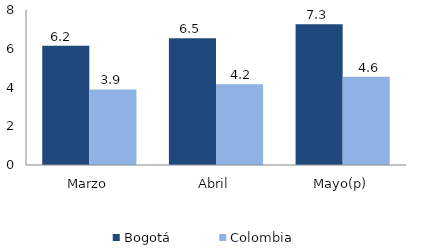
| Category | Bogotá | Colombia |
|---|---|---|
| Marzo | 6.151 | 3.9 |
| Abril | 6.547 | 4.17 |
| Mayo(p) | 7.261 | 4.555 |